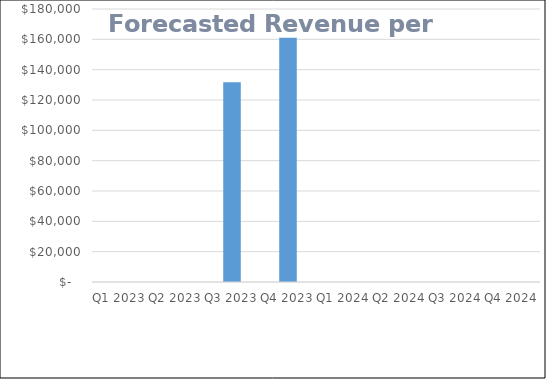
| Category | Forecasted Revenue |
|---|---|
| Q1 2023 | 0 |
| Q2 2023 | 0 |
| Q3 2023 | 131750 |
| Q4 2023 | 161000 |
| Q1 2024 | 0 |
| Q2 2024 | 0 |
| Q3 2024 | 0 |
| Q4 2024 | 0 |